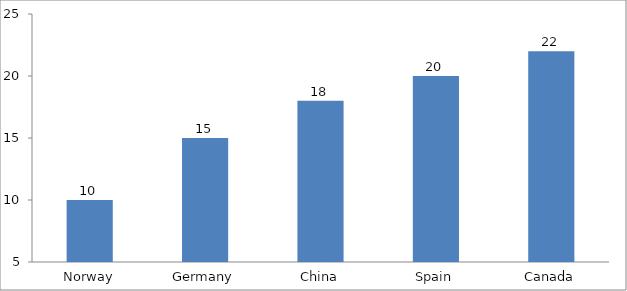
| Category | Value |
|---|---|
| Norway | 10 |
| Germany | 15 |
| China | 18 |
| Spain | 20 |
| Canada | 22 |